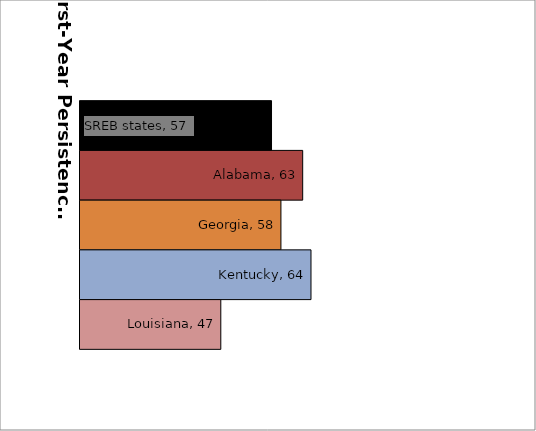
| Category | SREB states | Alabama | Georgia | Kentucky | Louisiana |
|---|---|---|---|---|---|
| 0 | 56.568 | 62.519 | 58.363 | 64.103 | 46.884 |